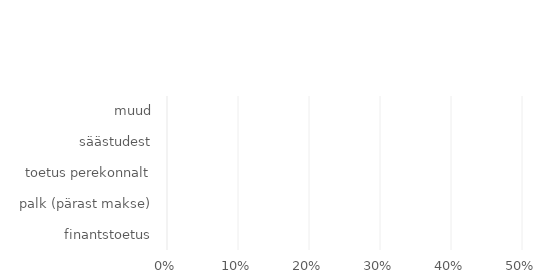
| Category | Series 0 |
|---|---|
| finantstoetus | 0 |
| palk (pärast makse) | 0 |
| toetus perekonnalt | 0 |
| säästudest | 0 |
| muud | 0 |